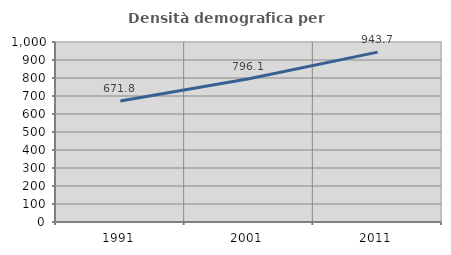
| Category | Densità demografica |
|---|---|
| 1991.0 | 671.786 |
| 2001.0 | 796.139 |
| 2011.0 | 943.742 |